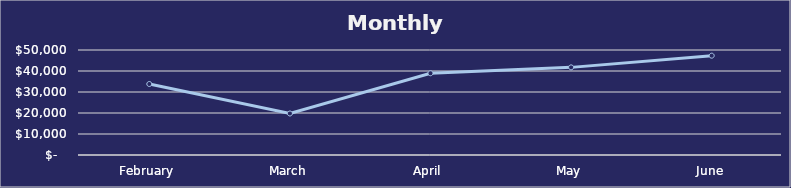
| Category | Series 0 |
|---|---|
| February | 33810 |
| March | 19761.5 |
| April | 38932 |
| May | 41727 |
| June | 47295.5 |